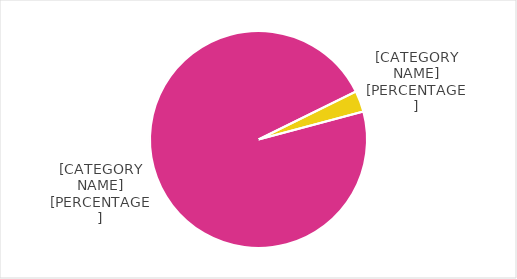
| Category | Series 0 |
|---|---|
| vrouwen | 62 |
| mannen | 2 |